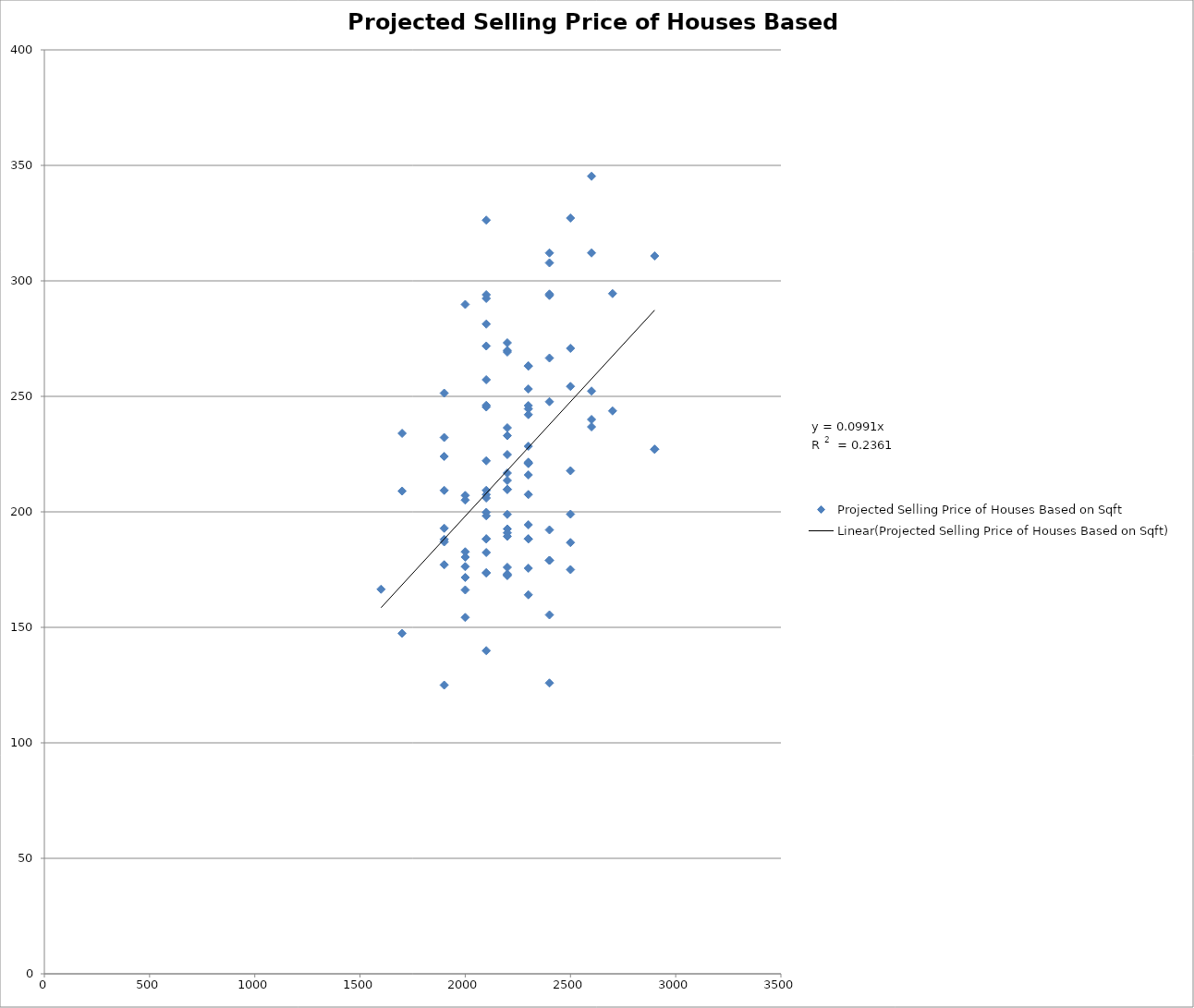
| Category | Projected Selling Price of Houses Based on Sqft |
|---|---|
| 2300.0 | 263.1 |
| 2100.0 | 182.4 |
| 2300.0 | 242.1 |
| 2200.0 | 213.6 |
| 2100.0 | 139.9 |
| 2100.0 | 245.4 |
| 2500.0 | 327.2 |
| 2100.0 | 271.8 |
| 2300.0 | 221.1 |
| 2400.0 | 266.6 |
| 2100.0 | 292.4 |
| 1700.0 | 209 |
| 2500.0 | 270.8 |
| 2100.0 | 246.1 |
| 2300.0 | 194.4 |
| 2100.0 | 281.3 |
| 2200.0 | 172.7 |
| 2300.0 | 207.5 |
| 2200.0 | 198.9 |
| 1900.0 | 209.3 |
| 2600.0 | 252.3 |
| 1900.0 | 192.9 |
| 2100.0 | 209.3 |
| 2600.0 | 345.3 |
| 2100.0 | 326.3 |
| 2200.0 | 173.1 |
| 1900.0 | 187 |
| 2100.0 | 257.2 |
| 2200.0 | 233 |
| 2000.0 | 180.4 |
| 1700.0 | 234 |
| 2000.0 | 207.1 |
| 2400.0 | 247.7 |
| 2000.0 | 166.2 |
| 1900.0 | 177.1 |
| 2000.0 | 182.7 |
| 2300.0 | 216 |
| 2600.0 | 312.1 |
| 2100.0 | 199.8 |
| 2200.0 | 273.2 |
| 2100.0 | 206 |
| 1900.0 | 232.2 |
| 2100.0 | 198.3 |
| 2000.0 | 205.1 |
| 2300.0 | 175.6 |
| 2400.0 | 307.8 |
| 2200.0 | 269.2 |
| 2200.0 | 224.8 |
| 2000.0 | 171.6 |
| 2200.0 | 216.8 |
| 2200.0 | 192.6 |
| 2200.0 | 236.4 |
| 2200.0 | 172.4 |
| 1900.0 | 251.4 |
| 2300.0 | 246 |
| 1700.0 | 147.4 |
| 2200.0 | 176 |
| 2300.0 | 228.4 |
| 1600.0 | 166.5 |
| 2200.0 | 189.4 |
| 2400.0 | 312.1 |
| 2000.0 | 289.8 |
| 2200.0 | 269.9 |
| 2000.0 | 154.3 |
| 2100.0 | 222.1 |
| 2200.0 | 209.7 |
| 2200.0 | 190.9 |
| 2500.0 | 254.3 |
| 2100.0 | 207.5 |
| 2200.0 | 209.7 |
| 2100.0 | 294 |
| 2000.0 | 176.3 |
| 2400.0 | 294.3 |
| 1900.0 | 224 |
| 1900.0 | 125 |
| 2600.0 | 236.8 |
| 2300.0 | 164.1 |
| 2500.0 | 217.8 |
| 2400.0 | 192.2 |
| 2400.0 | 125.9 |
| 2300.0 | 220.9 |
| 2700.0 | 294.5 |
| 2300.0 | 244.6 |
| 2500.0 | 199 |
| 2600.0 | 240 |
| 2300.0 | 263.2 |
| 1900.0 | 188.1 |
| 2700.0 | 243.7 |
| 2300.0 | 221.5 |
| 2500.0 | 175 |
| 2300.0 | 253.2 |
| 2400.0 | 155.4 |
| 2500.0 | 186.7 |
| 2400.0 | 179 |
| 2100.0 | 188.3 |
| 2900.0 | 227.1 |
| 2100.0 | 173.6 |
| 2300.0 | 188.3 |
| 2900.0 | 310.8 |
| 2400.0 | 293.7 |
| 2400.0 | 179 |
| 2100.0 | 188.3 |
| 2900.0 | 227.1 |
| 2100.0 | 173.6 |
| 2300.0 | 188.3 |